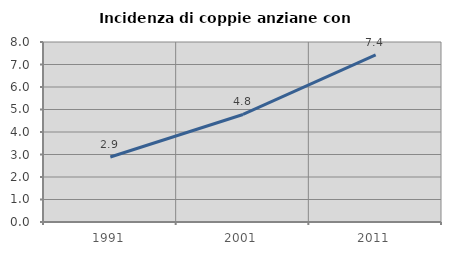
| Category | Incidenza di coppie anziane con figli |
|---|---|
| 1991.0 | 2.888 |
| 2001.0 | 4.778 |
| 2011.0 | 7.432 |